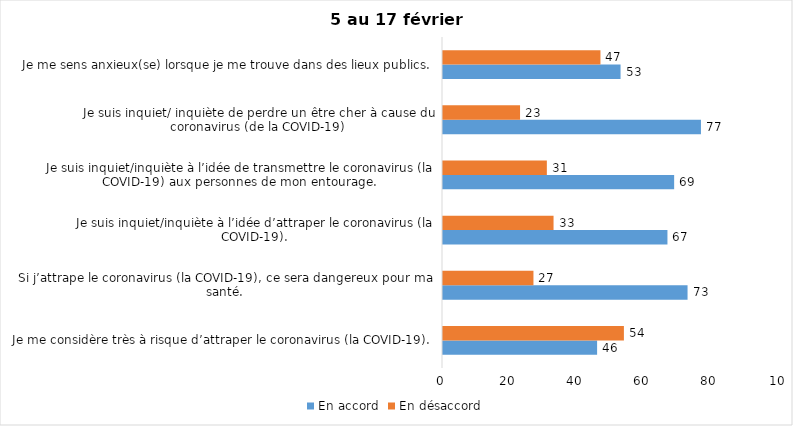
| Category | En accord | En désaccord |
|---|---|---|
| Je me considère très à risque d’attraper le coronavirus (la COVID-19). | 46 | 54 |
| Si j’attrape le coronavirus (la COVID-19), ce sera dangereux pour ma santé. | 73 | 27 |
| Je suis inquiet/inquiète à l’idée d’attraper le coronavirus (la COVID-19). | 67 | 33 |
| Je suis inquiet/inquiète à l’idée de transmettre le coronavirus (la COVID-19) aux personnes de mon entourage. | 69 | 31 |
| Je suis inquiet/ inquiète de perdre un être cher à cause du coronavirus (de la COVID-19) | 77 | 23 |
| Je me sens anxieux(se) lorsque je me trouve dans des lieux publics. | 53 | 47 |